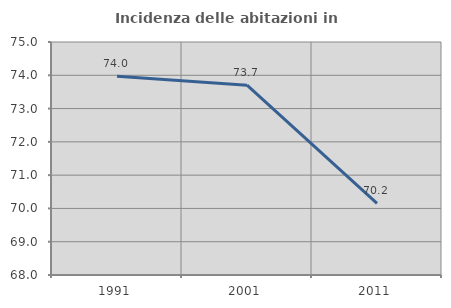
| Category | Incidenza delle abitazioni in proprietà  |
|---|---|
| 1991.0 | 73.968 |
| 2001.0 | 73.704 |
| 2011.0 | 70.153 |